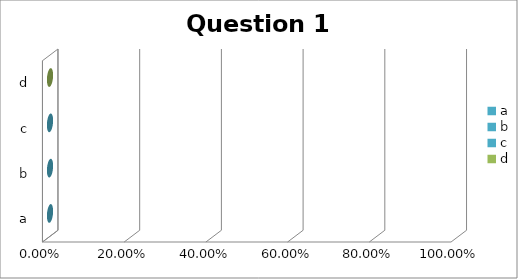
| Category | Series 0 |
|---|---|
| a | 0 |
| b | 0 |
| c | 0 |
| d | 0 |